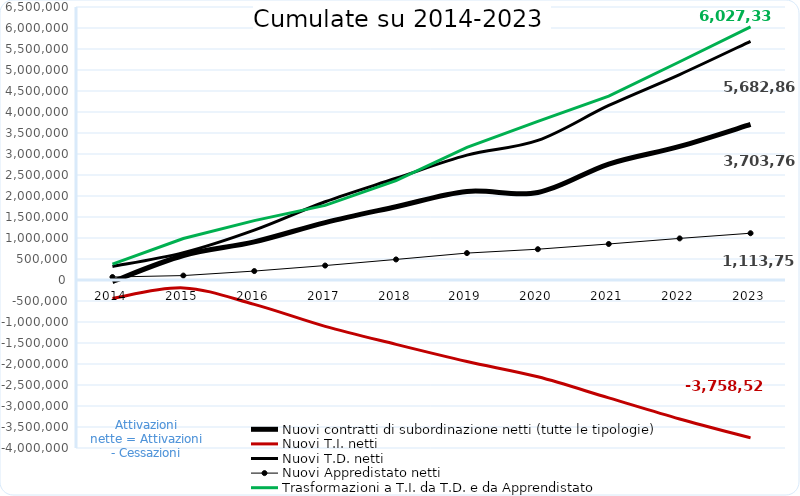
| Category | Nuovi contratti di subordinazione netti (tutte le tipologie) | Nuovi T.I. netti  | Nuovi T.D. netti  | Nuovi Appredistato netti | Trasformazioni a T.I. da T.D. e da Apprendistato |
|---|---|---|---|---|---|
| 2014.0 | -36974 | -438794 | 322226 | 70777 | 378232 |
| 2015.0 | 583812 | -188574 | 652640 | 105463 | 988142 |
| 2016.0 | 907890 | -579988 | 1189143 | 212516 | 1413259 |
| 2017.0 | 1367093 | -1103186 | 1863165 | 344088 | 1776851 |
| 2018.0 | 1745137 | -1532573 | 2422057 | 489236 | 2366431 |
| 2019.0 | 2108046 | -1940397 | 2972810 | 640833 | 3155563 |
| 2020.0 | 2084110 | -2305143 | 3322574 | 732989 | 3778487 |
| 2021.0 | 2761088 | -2806507 | 4155605 | 857549 | 4376226 |
| 2022.0 | 3180714 | -3309065 | 4891678 | 990388 | 5196889 |
| 2023.0 | 3703765 | -3758525 | 5682867 | 1113751 | 6027337 |